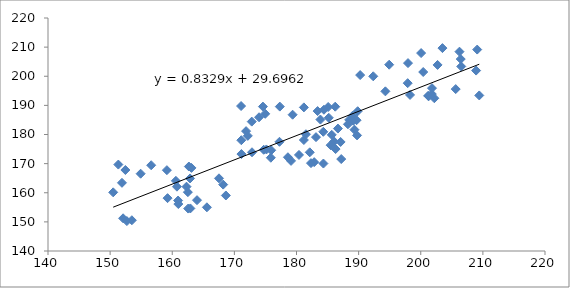
| Category | Series 0 |
|---|---|
| 152.6938730632556 | 150.269 |
| 178.6203954409923 | 172.191 |
| 186.669864361245 | 182.038 |
| 171.1156313777393 | 178.041 |
| 182.134154682393 | 173.887 |
| 206.5163498362705 | 203.362 |
| 185.1026273432773 | 189.445 |
| 181.5199906584692 | 180.092 |
| 197.8991862029835 | 197.624 |
| 175.8663821673487 | 172.017 |
| 201.1912726526301 | 193.288 |
| 201.2777447406253 | 193.13 |
| 162.5130686317872 | 160.208 |
| 202.184782284771 | 192.451 |
| 175.9292208949639 | 174.584 |
| 156.6110409506926 | 169.445 |
| 203.4915162434353 | 209.663 |
| 162.8648810789742 | 164.91 |
| 201.8060357416493 | 195.917 |
| 198.275503617897 | 193.579 |
| 201.7835555986187 | 193.88 |
| 160.9806182363224 | 156.126 |
| 197.9496574802393 | 204.517 |
| 162.2963466719219 | 162.083 |
| 200.3985772021183 | 201.453 |
| 187.1984333431735 | 171.568 |
| 187.101736428191 | 177.439 |
| 172.1639096720733 | 179.529 |
| 181.1864394664431 | 189.31 |
| 160.938602942719 | 157.332 |
| 183.3963952537924 | 188.038 |
| 205.6253563407533 | 195.593 |
| 177.2595856911521 | 177.495 |
| 190.2468012144481 | 200.404 |
| 159.1358247806375 | 167.753 |
| 153.4982232403837 | 150.558 |
| 168.1964264571383 | 162.796 |
| 192.3548797834112 | 199.986 |
| 159.2462679269573 | 158.145 |
| 206.2344604672464 | 208.435 |
| 185.493722064216 | 176.332 |
| 186.2931317351587 | 175.002 |
| 162.6771634434064 | 169.004 |
| 206.4378649030981 | 205.904 |
| 209.0851390519004 | 209.159 |
| 173.9706721248938 | 185.914 |
| 185.1974715511378 | 185.734 |
| 186.059358016833 | 177.598 |
| 179.3761149491519 | 186.792 |
| 160.7552135992834 | 162.082 |
| 160.5810910510501 | 164.088 |
| 162.9164717704943 | 154.616 |
| 183.8527493428152 | 185.13 |
| 162.5671177810658 | 154.57 |
| 202.7082171240844 | 203.887 |
| 152.0867471852845 | 151.224 |
| 194.3072176553587 | 194.814 |
| 152.4567801779698 | 167.808 |
| 209.4199191001696 | 193.41 |
| 163.088595857395 | 168.532 |
| 181.1849347890141 | 178.106 |
| 189.6682756358191 | 184.907 |
| 184.3318623973651 | 170.028 |
| 165.5766611370774 | 155.001 |
| 182.3336913928251 | 170.169 |
| 189.326195331622 | 181.652 |
| 174.9672663961916 | 187.108 |
| 150.4948266850923 | 160.14 |
| 189.0399051636813 | 186.462 |
| 151.9055326606503 | 163.407 |
| 185.6780042406772 | 179.883 |
| 151.3234891823576 | 169.677 |
| 189.1450604907506 | 184.716 |
| 154.9143993291578 | 166.537 |
| 208.9130122638154 | 201.949 |
| 174.7237801685892 | 174.759 |
| 171.1341504385964 | 173.284 |
| 186.2333270162778 | 189.546 |
| 189.8505364837141 | 187.991 |
| 172.8373398973895 | 173.901 |
| 188.4772465208816 | 185.034 |
| 180.3979681229758 | 172.978 |
| 184.417509333485 | 188.508 |
| 163.9850398792773 | 157.453 |
| 188.2835692944994 | 183.523 |
| 200.0583040187331 | 207.958 |
| 184.3113034420935 | 180.931 |
| 174.5965067116698 | 189.577 |
| 194.9199956735928 | 203.967 |
| 171.0773835478551 | 189.77 |
| 179.1242046867662 | 170.943 |
| 175.1563424482429 | 174.863 |
| 177.3145568351262 | 189.581 |
| 172.7972018109551 | 184.421 |
| 171.8855668082722 | 181.154 |
| 183.1409117997143 | 179.091 |
| 167.5233927986312 | 164.955 |
| 182.8470638628751 | 170.503 |
| 168.6295116714404 | 159.063 |
| 189.7471635800557 | 179.7 |